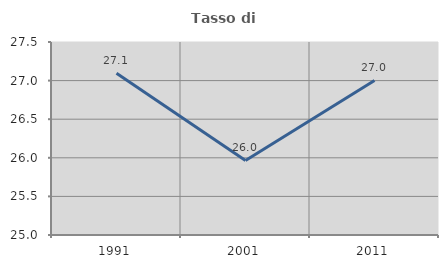
| Category | Tasso di occupazione   |
|---|---|
| 1991.0 | 27.095 |
| 2001.0 | 25.966 |
| 2011.0 | 27.002 |